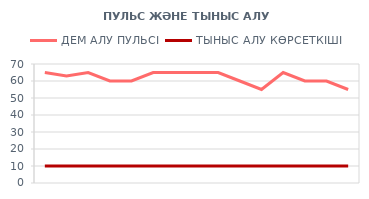
| Category | ДЕМ АЛУ ПУЛЬСІ | ТЫНЫС АЛУ КӨРСЕТКІШІ |
|---|---|---|
| 2012-06-01 | 65 | 10 |
| 2012-06-02 | 63 | 10 |
| 2012-06-03 | 65 | 10 |
| 2012-06-04 | 60 | 10 |
| 2012-06-05 | 60 | 10 |
| 2012-06-06 | 65 | 10 |
| 2012-06-07 | 65 | 10 |
| 2012-06-08 | 65 | 10 |
| 2012-06-09 | 65 | 10 |
| 2012-06-10 | 60 | 10 |
| 2012-06-11 | 55 | 10 |
| 2012-06-12 | 65 | 10 |
| 2012-06-13 | 60 | 10 |
| 2012-06-14 | 60 | 10 |
| 2012-06-15 | 55 | 10 |